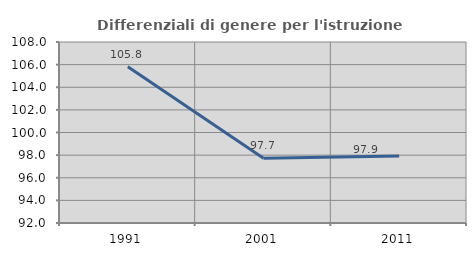
| Category | Differenziali di genere per l'istruzione superiore |
|---|---|
| 1991.0 | 105.822 |
| 2001.0 | 97.733 |
| 2011.0 | 97.915 |